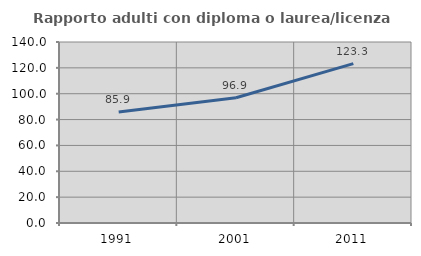
| Category | Rapporto adulti con diploma o laurea/licenza media  |
|---|---|
| 1991.0 | 85.897 |
| 2001.0 | 96.861 |
| 2011.0 | 123.293 |